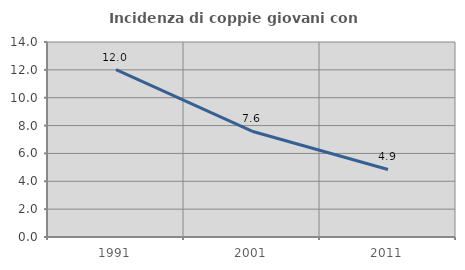
| Category | Incidenza di coppie giovani con figli |
|---|---|
| 1991.0 | 12.016 |
| 2001.0 | 7.593 |
| 2011.0 | 4.851 |